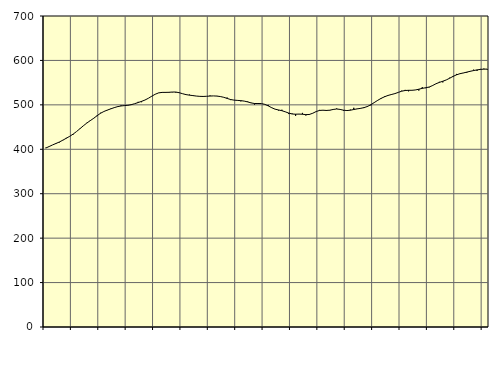
| Category | Piggar | Series 1 |
|---|---|---|
| nan | 403.5 | 402.73 |
| 87.0 | 405.9 | 406.19 |
| 87.0 | 409.8 | 409.79 |
| 87.0 | 413.7 | 413.06 |
| nan | 415.5 | 416.46 |
| 88.0 | 421 | 420.46 |
| 88.0 | 425.7 | 424.79 |
| 88.0 | 428.8 | 429.15 |
| nan | 433 | 434.12 |
| 89.0 | 439.9 | 439.92 |
| 89.0 | 445.8 | 446.35 |
| 89.0 | 452.6 | 452.87 |
| nan | 459.5 | 458.97 |
| 90.0 | 463.7 | 464.39 |
| 90.0 | 469.1 | 469.7 |
| 90.0 | 474.7 | 475.55 |
| nan | 482.1 | 480.97 |
| 91.0 | 485.1 | 485.08 |
| 91.0 | 487.8 | 488.24 |
| 91.0 | 491.6 | 490.96 |
| nan | 494 | 493.7 |
| 92.0 | 496.7 | 496.02 |
| 92.0 | 498.7 | 497.5 |
| 92.0 | 497.9 | 498.36 |
| nan | 499.4 | 499.01 |
| 93.0 | 501.4 | 500.41 |
| 93.0 | 502.6 | 502.66 |
| 93.0 | 506.8 | 505.19 |
| nan | 506 | 507.84 |
| 94.0 | 510.9 | 510.87 |
| 94.0 | 514.8 | 514.85 |
| 94.0 | 519.3 | 519.55 |
| nan | 523.8 | 523.92 |
| 95.0 | 527.2 | 526.95 |
| 95.0 | 528.5 | 528.04 |
| 95.0 | 527.2 | 528.06 |
| nan | 528.8 | 528.27 |
| 96.0 | 528.3 | 528.85 |
| 96.0 | 527.7 | 528.85 |
| 96.0 | 527.9 | 527.33 |
| nan | 524.9 | 525.05 |
| 97.0 | 522.8 | 523.05 |
| 97.0 | 523.1 | 521.8 |
| 97.0 | 520.1 | 520.84 |
| nan | 519.9 | 519.83 |
| 98.0 | 519.5 | 519.15 |
| 98.0 | 519.8 | 518.92 |
| 98.0 | 519.4 | 519.27 |
| nan | 521 | 519.86 |
| 99.0 | 520.1 | 520.12 |
| 99.0 | 520.1 | 519.74 |
| 99.0 | 518.5 | 518.73 |
| nan | 516.9 | 517.05 |
| 0.0 | 516.4 | 514.48 |
| 0.0 | 510.7 | 512.05 |
| 0.0 | 510.7 | 510.68 |
| nan | 509.5 | 510.07 |
| 1.0 | 507.9 | 509.49 |
| 1.0 | 508.3 | 508.45 |
| 1.0 | 507.6 | 506.61 |
| nan | 504.8 | 504.36 |
| 2.0 | 500.7 | 503.05 |
| 2.0 | 504.1 | 503.01 |
| 2.0 | 503 | 502.9 |
| nan | 501.4 | 501.14 |
| 3.0 | 499.9 | 497.73 |
| 3.0 | 493.1 | 493.64 |
| 3.0 | 490.2 | 490.32 |
| nan | 487.3 | 488.51 |
| 4.0 | 489 | 486.86 |
| 4.0 | 484.5 | 484.3 |
| 4.0 | 479.3 | 481.47 |
| nan | 480.4 | 479.39 |
| 5.0 | 475.2 | 478.99 |
| 5.0 | 479.1 | 479.24 |
| 5.0 | 481.9 | 478.86 |
| nan | 476 | 478.02 |
| 6.0 | 477.3 | 478.34 |
| 6.0 | 481.4 | 481.08 |
| 6.0 | 484.8 | 484.92 |
| nan | 488.6 | 487.45 |
| 7.0 | 488.1 | 487.93 |
| 7.0 | 486.2 | 487.42 |
| 7.0 | 487.4 | 487.97 |
| nan | 490.4 | 489.67 |
| 8.0 | 491.8 | 490.65 |
| 8.0 | 489.7 | 489.75 |
| 8.0 | 486.7 | 487.96 |
| nan | 487.2 | 487.19 |
| 9.0 | 489.3 | 487.94 |
| 9.0 | 493.4 | 489.54 |
| 9.0 | 491.4 | 490.95 |
| nan | 491.5 | 492.17 |
| 10.0 | 492.8 | 493.78 |
| 10.0 | 497.4 | 496.39 |
| 10.0 | 498.8 | 500.36 |
| nan | 505.9 | 505.27 |
| 11.0 | 509.9 | 510.28 |
| 11.0 | 513.7 | 514.67 |
| 11.0 | 519.4 | 518.27 |
| nan | 520.9 | 521.17 |
| 12.0 | 524.1 | 523.28 |
| 12.0 | 525.6 | 525.31 |
| 12.0 | 527.9 | 528.09 |
| nan | 531.9 | 530.78 |
| 13.0 | 533.7 | 532.31 |
| 13.0 | 530.5 | 532.76 |
| 13.0 | 532.8 | 532.8 |
| nan | 533.7 | 533.51 |
| 14.0 | 532.2 | 535.23 |
| 14.0 | 539.8 | 537.12 |
| 14.0 | 537.6 | 538.51 |
| nan | 539.2 | 540.12 |
| 15.0 | 543.9 | 543.37 |
| 15.0 | 547.4 | 547.44 |
| 15.0 | 551.8 | 550.56 |
| nan | 550.6 | 553.15 |
| 16.0 | 556.1 | 556.02 |
| 16.0 | 561.1 | 559.91 |
| 16.0 | 565 | 564.06 |
| nan | 569.6 | 567.54 |
| 17.0 | 569.7 | 570.09 |
| 17.0 | 571.5 | 571.79 |
| 17.0 | 572.3 | 573.65 |
| nan | 575 | 575.53 |
| 18.0 | 579.2 | 577.17 |
| 18.0 | 576.5 | 578.69 |
| 18.0 | 580.9 | 579.8 |
| nan | 581.6 | 580.38 |
| 19.0 | 579.1 | 580.49 |